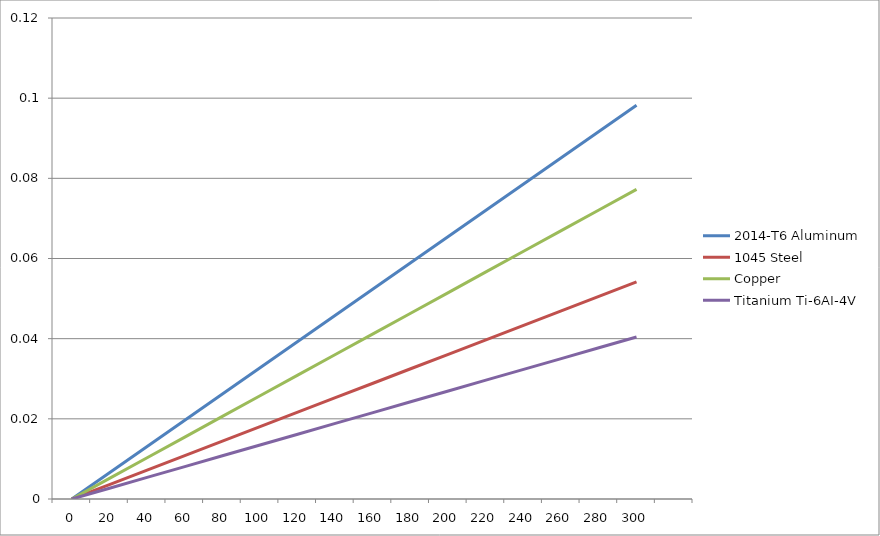
| Category | 2014-T6 Aluminum | 1045 Steel | Copper | Titanium Ti-6AI-4V |
|---|---|---|---|---|
| 0.0 | 0 | 0 | 0 | 0 |
| 20.0 | 0.007 | 0.004 | 0.005 | 0.003 |
| 40.0 | 0.013 | 0.007 | 0.01 | 0.005 |
| 60.0 | 0.02 | 0.011 | 0.015 | 0.008 |
| 80.0 | 0.026 | 0.014 | 0.021 | 0.011 |
| 100.0 | 0.033 | 0.018 | 0.026 | 0.013 |
| 120.0 | 0.039 | 0.022 | 0.031 | 0.016 |
| 140.0 | 0.046 | 0.025 | 0.036 | 0.019 |
| 160.0 | 0.052 | 0.029 | 0.041 | 0.022 |
| 180.0 | 0.059 | 0.032 | 0.046 | 0.024 |
| 200.0 | 0.066 | 0.036 | 0.052 | 0.027 |
| 220.0 | 0.072 | 0.04 | 0.057 | 0.03 |
| 240.0 | 0.079 | 0.043 | 0.062 | 0.032 |
| 260.0 | 0.085 | 0.047 | 0.067 | 0.035 |
| 280.0 | 0.092 | 0.051 | 0.072 | 0.038 |
| 300.0 | 0.098 | 0.054 | 0.077 | 0.04 |